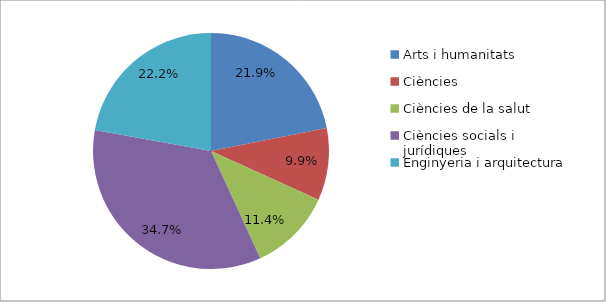
| Category | Series 0 |
|---|---|
| Arts i humanitats | 0.219 |
| Ciències | 0.099 |
| Ciències de la salut | 0.114 |
| Ciències socials i jurídiques | 0.347 |
| Enginyeria i arquitectura | 0.222 |